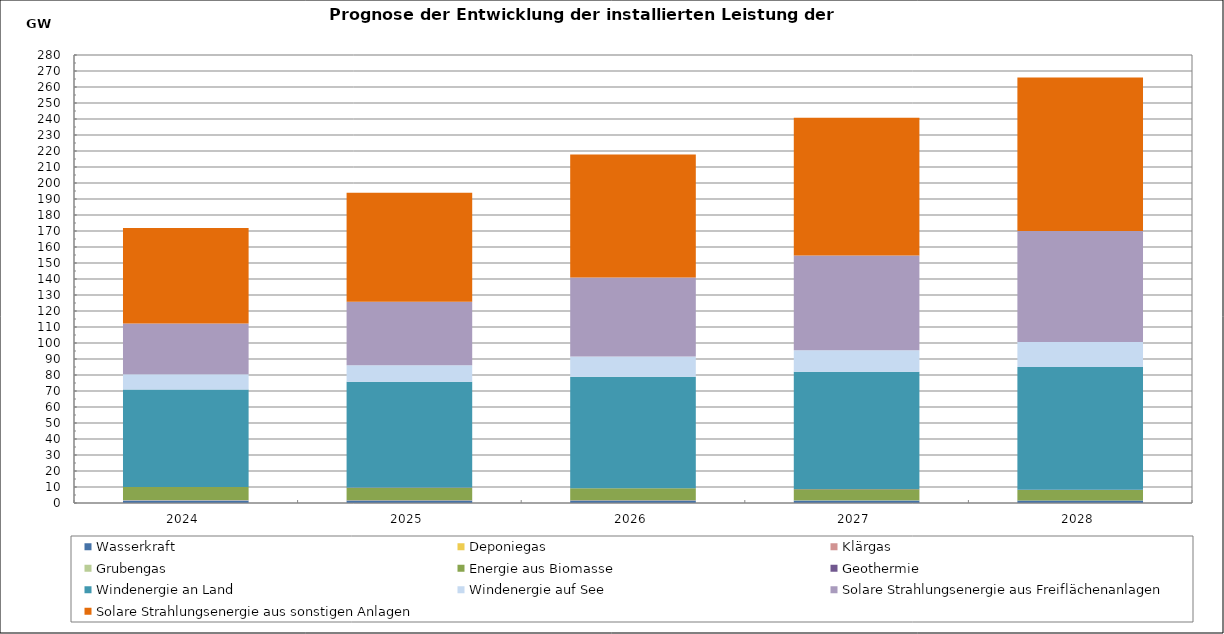
| Category | Wasserkraft | Deponiegas | Klärgas | Grubengas | Energie aus Biomasse | Geothermie | Windenergie an Land | Windenergie auf See | Solare Strahlungsenergie aus Freiflächenanlagen | Solare Strahlungsenergie aus sonstigen Anlagen |
|---|---|---|---|---|---|---|---|---|---|---|
| 2024.0 | 1517.807 | 108.337 | 71.072 | 144.536 | 8145.303 | 72.666 | 60915.03 | 9560.318 | 31703.337 | 59634.828 |
| 2025.0 | 1516.106 | 62.916 | 72.369 | 104.198 | 7852.744 | 83.566 | 66085.84 | 10256.818 | 39812.631 | 68044.883 |
| 2026.0 | 1514.405 | 54.301 | 73.665 | 50.829 | 7478.127 | 96.101 | 69631.623 | 12697.318 | 49295.669 | 76898.725 |
| 2027.0 | 1512.705 | 51.998 | 74.962 | 7.136 | 6981.214 | 110.516 | 73331.685 | 13351.818 | 59268.535 | 86166.793 |
| 2028.0 | 1511.004 | 49.293 | 76.259 | 2.386 | 6563.378 | 127.093 | 76600.483 | 15641.818 | 69421.719 | 95874.692 |